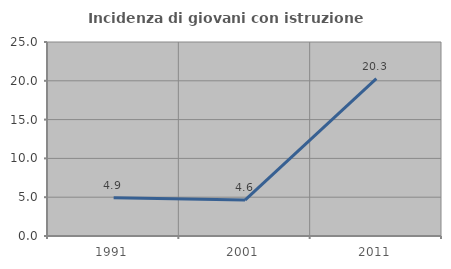
| Category | Incidenza di giovani con istruzione universitaria |
|---|---|
| 1991.0 | 4.918 |
| 2001.0 | 4.636 |
| 2011.0 | 20.27 |